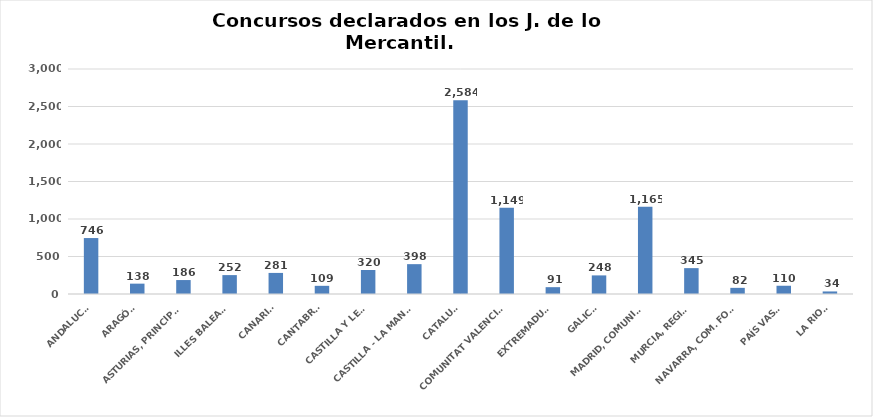
| Category | Series 0 |
|---|---|
| ANDALUCÍA | 746 |
| ARAGÓN | 138 |
| ASTURIAS, PRINCIPADO | 186 |
| ILLES BALEARS | 252 |
| CANARIAS | 281 |
| CANTABRIA | 109 |
| CASTILLA Y LEÓN | 320 |
| CASTILLA - LA MANCHA | 398 |
| CATALUÑA | 2584 |
| COMUNITAT VALENCIANA | 1149 |
| EXTREMADURA | 91 |
| GALICIA | 248 |
| MADRID, COMUNIDAD | 1165 |
| MURCIA, REGIÓN | 345 |
| NAVARRA, COM. FORAL | 82 |
| PAÍS VASCO | 110 |
| LA RIOJA | 34 |